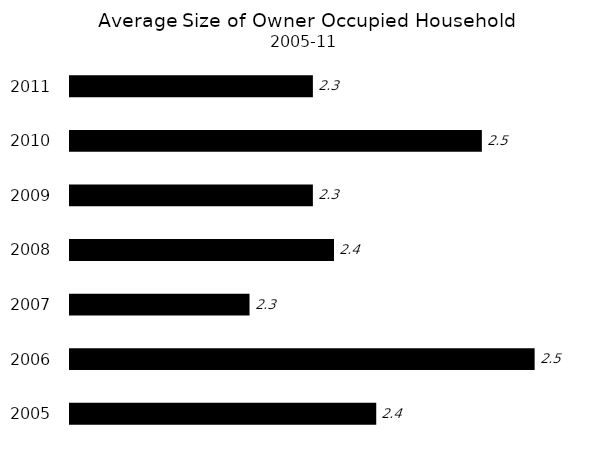
| Category | Size |
|---|---|
| 2005.0 | 2.39 |
| 2006.0 | 2.54 |
| 2007.0 | 2.27 |
| 2008.0 | 2.35 |
| 2009.0 | 2.33 |
| 2010.0 | 2.49 |
| 2011.0 | 2.33 |